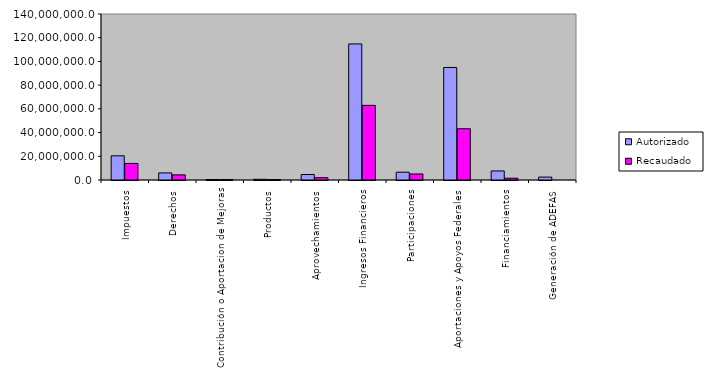
| Category | Autorizado | Recaudado |
|---|---|---|
| 0 | 20407536 | 13987429.9 |
| 1 | 5965480.3 | 4298321.1 |
| 2 | 421290.3 | 285701.7 |
| 3 | 591994.7 | 392058.8 |
| 4 | 4631664.6 | 1956889.2 |
| 5 | 114764158.7 | 62947080.9 |
| 6 | 6584458 | 5094421.7 |
| 7 | 94908676.1 | 43237704.4 |
| 8 | 7639931.6 | 1497796.8 |
| 9 | 2460661.3 | 0 |